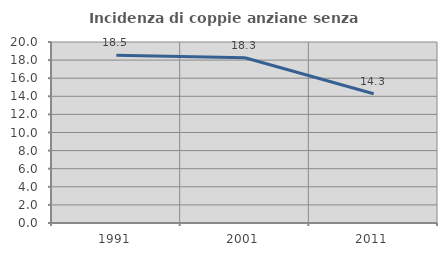
| Category | Incidenza di coppie anziane senza figli  |
|---|---|
| 1991.0 | 18.545 |
| 2001.0 | 18.266 |
| 2011.0 | 14.286 |